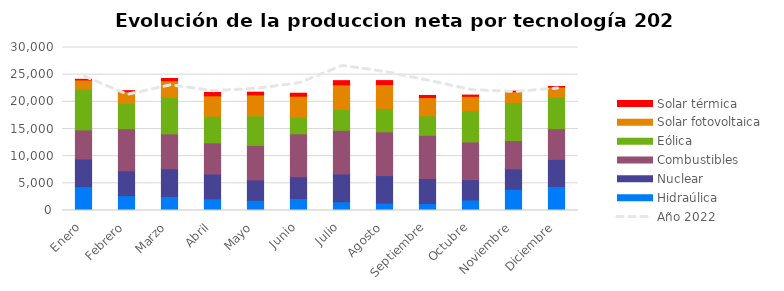
| Category | Hidraúlica | Nuclear | Combustibles | Eólica | Solar fotovoltaica | Solar térmica |
|---|---|---|---|---|---|---|
| Enero | 4401.98 | 5086.113 | 5342.613 | 7457.622 | 1738.472 | 119.508 |
| Febrero | 2724.81 | 4598.23 | 7728.125 | 4676.576 | 2147.858 | 178.785 |
| Marzo | 2584.146 | 5100.704 | 6418.435 | 6695.548 | 3090.86 | 409.94 |
| Abril | 2143.074 | 4570.952 | 5734.658 | 4900 | 3755.085 | 625.723 |
| Mayo | 1873.023 | 3751.494 | 6345.6 | 5456.474 | 3853.371 | 500.293 |
| Junio | 2203.384 | 4015.901 | 7897.297 | 3081.615 | 3843.747 | 541.904 |
| Julio | 1600.304 | 5121.873 | 8040.818 | 3835.871 | 4530.174 | 768.528 |
| Agosto | 1380.175 | 5050.952 | 8049.173 | 4263.463 | 4447.125 | 719.724 |
| Septiembre | 1282.352 | 4613.869 | 7946.632 | 3589.105 | 3343.478 | 399.728 |
| Octubre | 1931.912 | 3746.706 | 6942.845 | 5764.473 | 2628.538 | 226.738 |
| Noviembre | 3898.439 | 3767.065 | 5209.693 | 6995.902 | 1994.693 | 111.284 |
| Diciembre | 4419.516 | 4990.409 | 5646.35 | 5812.319 | 1865.921 | 92.06 |